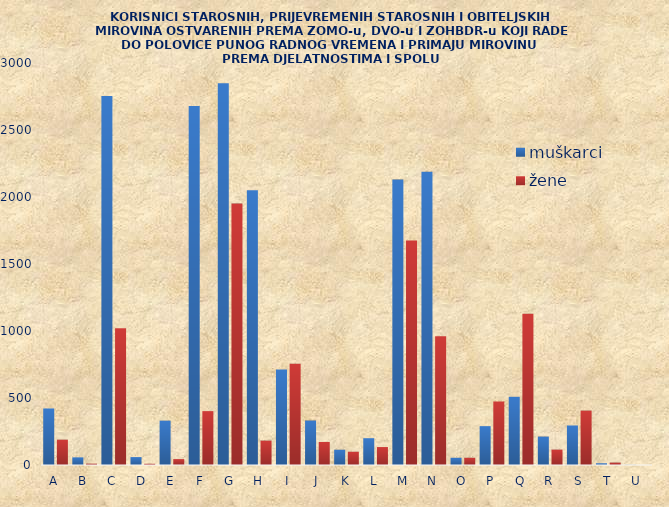
| Category | muškarci | žene |
|---|---|---|
| A | 422 | 189 |
| B | 57 | 10 |
| C | 2753 | 1020 |
| D | 59 | 9 |
| E | 331 | 44 |
| F | 2679 | 402 |
| G | 2848 | 1951 |
| H | 2050 | 182 |
| I | 713 | 756 |
| J | 332 | 172 |
| K | 114 | 99 |
| L | 200 | 134 |
| M | 2130 | 1676 |
| N | 2188 | 961 |
| O | 54 | 54 |
| P | 290 | 474 |
| Q | 509 | 1129 |
| R | 212 | 115 |
| S | 295 | 406 |
| T | 13 | 18 |
| U | 1 | 0 |